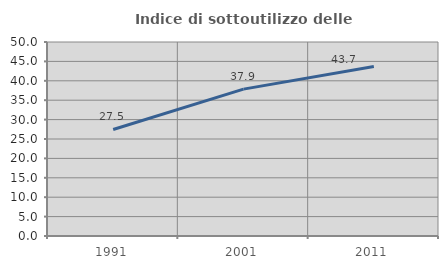
| Category | Indice di sottoutilizzo delle abitazioni  |
|---|---|
| 1991.0 | 27.461 |
| 2001.0 | 37.851 |
| 2011.0 | 43.692 |